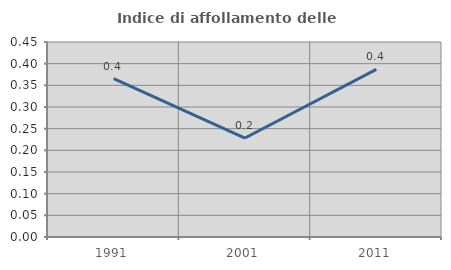
| Category | Indice di affollamento delle abitazioni  |
|---|---|
| 1991.0 | 0.365 |
| 2001.0 | 0.228 |
| 2011.0 | 0.387 |